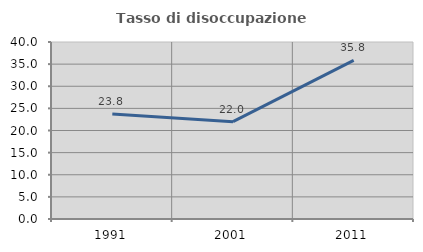
| Category | Tasso di disoccupazione giovanile  |
|---|---|
| 1991.0 | 23.75 |
| 2001.0 | 22 |
| 2011.0 | 35.849 |